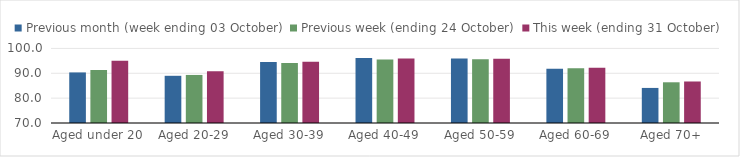
| Category | Previous month (week ending 03 October) | Previous week (ending 24 October) | This week (ending 31 October) |
|---|---|---|---|
| Aged under 20 | 90.35 | 91.36 | 95.02 |
| Aged 20-29 | 88.99 | 89.33 | 90.85 |
| Aged 30-39 | 94.59 | 94.12 | 94.65 |
| Aged 40-49 | 96.11 | 95.56 | 95.98 |
| Aged 50-59 | 95.91 | 95.6 | 95.85 |
| Aged 60-69 | 91.78 | 92.03 | 92.21 |
| Aged 70+ | 84.11 | 86.38 | 86.7 |